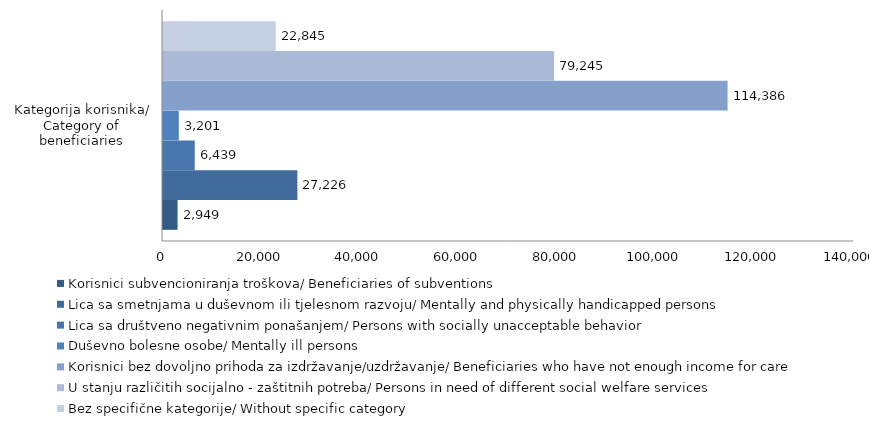
| Category | Korisnici subvencioniranja troškova/ Beneficiaries of subventions | Lica sa smetnjama u duševnom ili tjelesnom razvoju/ Mentally and physically handicapped persons | Lica sa društveno negativnim ponašanjem/ Persons with socially unacceptable behavior | Duševno bolesne osobe/ Mentally ill persons | Korisnici bez dovoljno prihoda za izdržavanje/uzdržavanje/ Beneficiaries who have not enough income for care | U stanju različitih socijalno - zaštitnih potreba/ Persons in need of different social welfare services | Bez specifične kategorije/ Without specific category |
|---|---|---|---|---|---|---|---|
| 0 | 2949 | 27226 | 6439 | 3201 | 114386 | 79245 | 22845 |